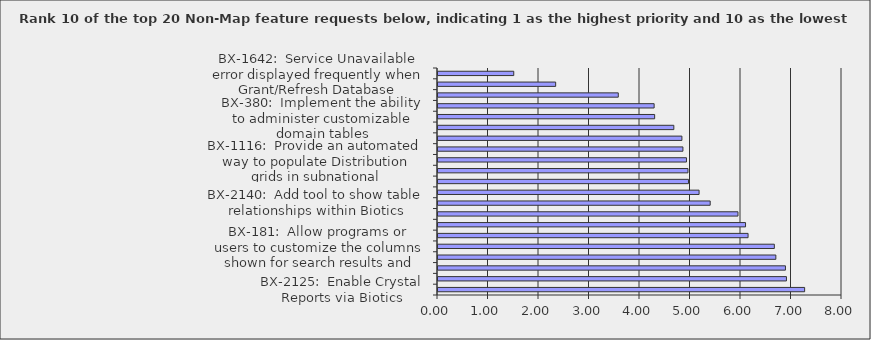
| Category | Series 0 |
|---|---|
| BX-2125:  Enable Crystal Reports via Biotics | 7.26 |
| Other: as specified below | 6.9 |
| BX-2273:  Allow programs to customize data entry screens (EO in particular) | 6.88 |
| BX-379:  Implement the ability to administer extensible tables | 6.69 |
| BX-181:  Allow programs or users to customize the columns shown for search results and working lists | 6.66 |
| BX-2783:  Investigate performance issues reported by programs via survey results | 6.14 |
| BX-2252:  Create online replacement for rank calculator spreadsheet | 6.09 |
| BX-1418:  Add specimen table to Source Feature | 5.94 |
| BX-2140:  Add tool to show table relationships within Biotics | 5.39 |
| BX-1665:  Increase non-spatial search results limit to 1000 | 5.17 |
| BX-1286:  Need Change Associated Element option for SFs | 4.96 |
| BX-828:  Show more Working Lists & list items per page | 4.95 |
| BX-1116:  Provide an automated way to populate Distribution grids in subnational characterization (CAS) records | 4.92 |
| BX-420:  Replicate "Record maintenance" and "Attribute Maintenance" functionality from Biotics 4, which provide access to the current record's audit log | 4.85 |
| BX-1250:  Implement Contacts screen and enable Contacts grids in related records | 4.83 |
| BX-537:  Add "Go To Record" functionality | 4.67 |
| BX-380:  Implement the ability to administer customizable domain tables | 4.29 |
| BX-381:  Implement the ability save and reuse search criteria | 4.28 |
| BX-2807:  Make improvements to the Biotics Data window to improve readiblity | 3.57 |
|  BX-871:  Long values in record headers can cause spacing issues and push some values offscreen | 2.33 |
| BX-1642:  Service Unavailable error displayed frequently when Grant/Refresh Database Privileges run | 1.5 |